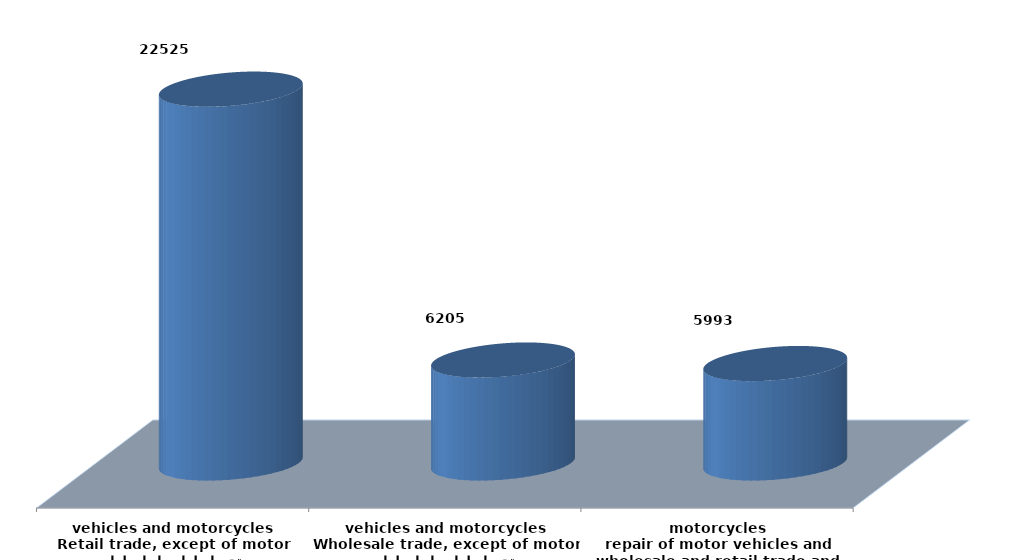
| Category | Series 0 |
|---|---|
| تجارة الجملة والتجزئة ،واصلاح المركبات ذات المحركات والدراجات النارية
wholesale and retail trade and repair of motor vehicles and motorcycles | 5993021 |
| تجارة الجملة ، باستثناء المركبات ذات المحركات والدراجات النارية
Wholesale trade, except of motor vehicles and motorcycles | 6204551 |
| تجارة التجزئة،باستثناء المركبات ذات المحركات والدراجات النارية
Retail trade, except of motor vehicles and motorcycles | 22524776 |